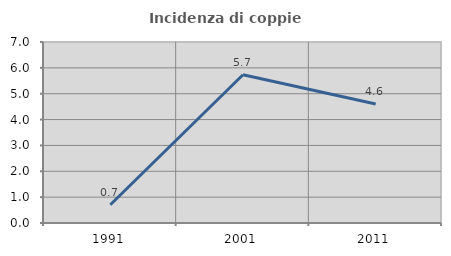
| Category | Incidenza di coppie miste |
|---|---|
| 1991.0 | 0.704 |
| 2001.0 | 5.732 |
| 2011.0 | 4.605 |